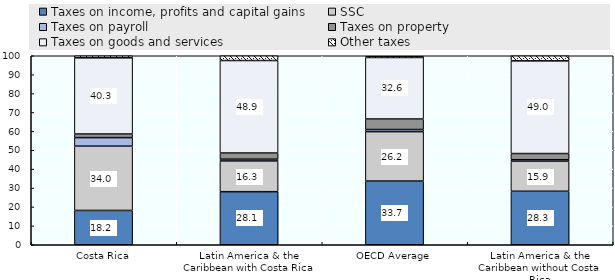
| Category | Taxes on income, profits and capital gains | SSC | Taxes on payroll | Taxes on property | Taxes on goods and services | Other taxes |
|---|---|---|---|---|---|---|
| Costa Rica | 18.156 | 34.023 | 4.505 | 1.916 | 40.314 | 1.086 |
| Latin America & the Caribbean with Costa Rica | 28.082 | 16.252 | 0.942 | 3.265 | 48.933 | 2.527 |
| OECD Average | 33.693 | 26.151 | 1.123 | 5.569 | 32.554 | 0.665 |
| Latin America & the Caribbean without Costa Rica | 28.308 | 15.853 | 0.823 | 3.283 | 49.034 | 2.699 |